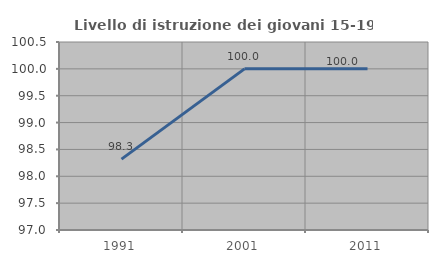
| Category | Livello di istruzione dei giovani 15-19 anni |
|---|---|
| 1991.0 | 98.319 |
| 2001.0 | 100 |
| 2011.0 | 100 |